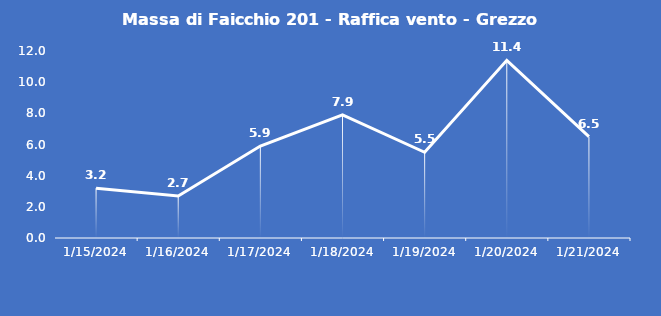
| Category | Massa di Faicchio 201 - Raffica vento - Grezzo (m/s) |
|---|---|
| 1/15/24 | 3.2 |
| 1/16/24 | 2.7 |
| 1/17/24 | 5.9 |
| 1/18/24 | 7.9 |
| 1/19/24 | 5.5 |
| 1/20/24 | 11.4 |
| 1/21/24 | 6.5 |